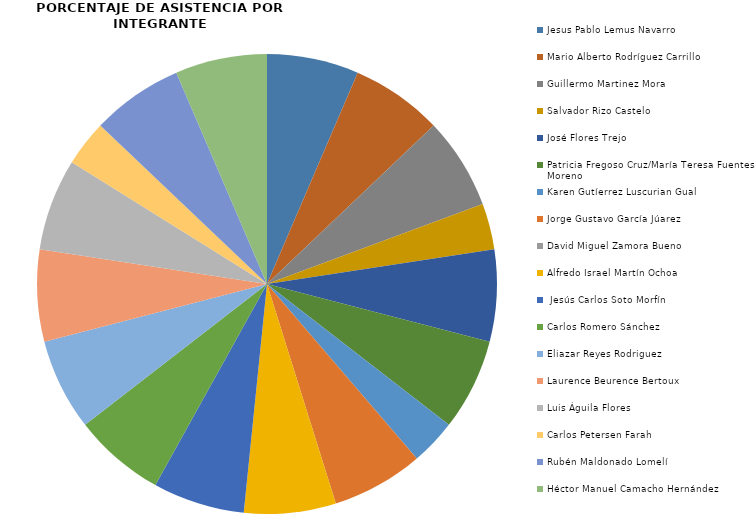
| Category | Series 0 |
|---|---|
| Jesus Pablo Lemus Navarro | 2 |
| Mario Alberto Rodríguez Carrillo | 2 |
| Guillermo Martinez Mora | 2 |
| Salvador Rizo Castelo | 1 |
| José Flores Trejo | 2 |
| Patricia Fregoso Cruz/María Teresa Fuentes Moreno | 2 |
| Karen Gutíerrez Luscurian Gual | 1 |
| Jorge Gustavo García Júarez | 2 |
| David Miguel Zamora Bueno | 0 |
| Alfredo Israel Martín Ochoa | 2 |
|  Jesús Carlos Soto Morfín | 2 |
| Carlos Romero Sánchez | 2 |
| Eliazar Reyes Rodriguez | 2 |
| Laurence Beurence Bertoux | 2 |
| Luis Águila Flores | 2 |
| Carlos Petersen Farah | 1 |
| Rubén Maldonado Lomelí | 2 |
| Héctor Manuel Camacho Hernández | 2 |